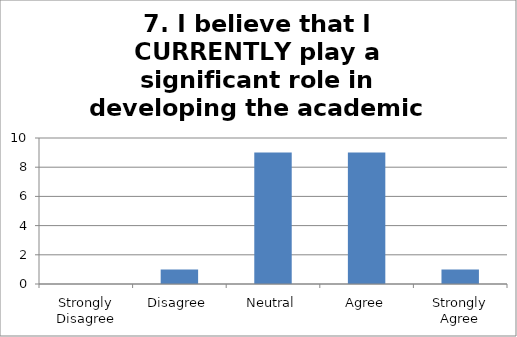
| Category | 7. I believe that I CURRENTLY play a significant role in developing the academic writing skills of my students. Responses |
|---|---|
| Strongly Disagree | 0 |
| Disagree | 1 |
| Neutral | 9 |
| Agree | 9 |
| Strongly Agree | 1 |